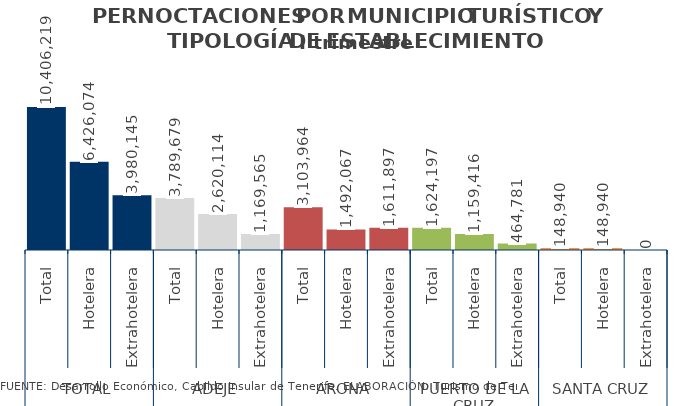
| Category | I trimestre 2014 |
|---|---|
| 0 | 10406219 |
| 1 | 6426074 |
| 2 | 3980145 |
| 3 | 3789679 |
| 4 | 2620114 |
| 5 | 1169565 |
| 6 | 3103964 |
| 7 | 1492067 |
| 8 | 1611897 |
| 9 | 1624197 |
| 10 | 1159416 |
| 11 | 464781 |
| 12 | 148940 |
| 13 | 148940 |
| 14 | 0 |